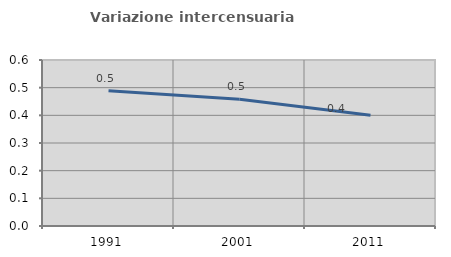
| Category | Variazione intercensuaria annua |
|---|---|
| 1991.0 | 0.489 |
| 2001.0 | 0.458 |
| 2011.0 | 0.401 |